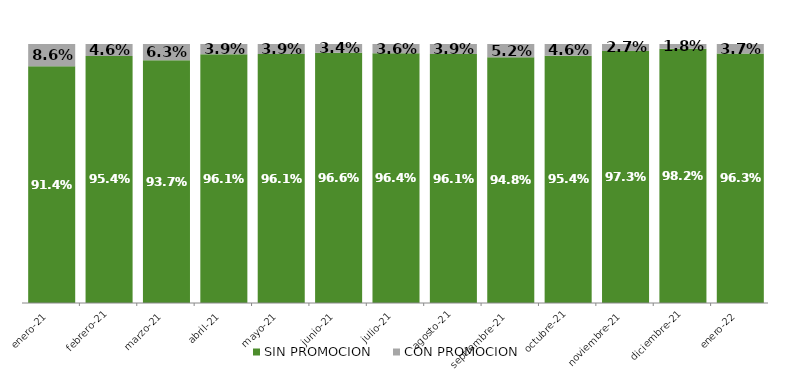
| Category | SIN PROMOCION   | CON PROMOCION   |
|---|---|---|
| 2021-01-01 | 0.914 | 0.086 |
| 2021-02-01 | 0.954 | 0.046 |
| 2021-03-01 | 0.937 | 0.063 |
| 2021-04-01 | 0.961 | 0.039 |
| 2021-05-01 | 0.961 | 0.039 |
| 2021-06-01 | 0.966 | 0.034 |
| 2021-07-01 | 0.964 | 0.036 |
| 2021-08-01 | 0.961 | 0.039 |
| 2021-09-01 | 0.948 | 0.052 |
| 2021-10-01 | 0.954 | 0.046 |
| 2021-11-01 | 0.973 | 0.027 |
| 2021-12-01 | 0.982 | 0.018 |
| 2022-01-01 | 0.963 | 0.037 |